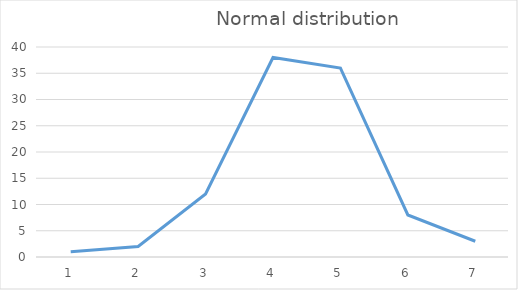
| Category | Series 0 |
|---|---|
| 0 | 1 |
| 1 | 2 |
| 2 | 12 |
| 3 | 38 |
| 4 | 36 |
| 5 | 8 |
| 6 | 3 |